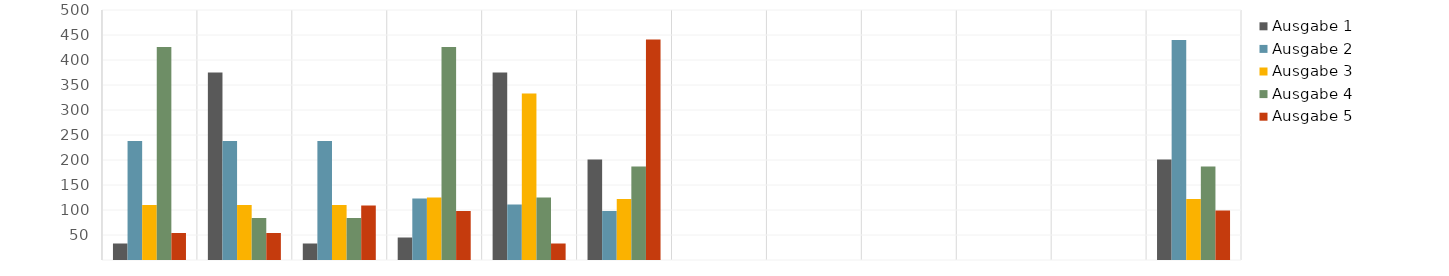
| Category | Ausgabe 1 | Ausgabe 2 | Ausgabe 3 | Ausgabe 4 | Ausgabe 5 |
|---|---|---|---|---|---|
| Jan | 33 | 238 | 110 | 426 | 54 |
| Feb | 375 | 238 | 110 | 84 | 54 |
| Mrz | 33 | 238 | 110 | 84 | 109 |
| Apr | 45 | 123 | 125 | 426 | 98 |
| Mai | 375 | 111 | 333 | 125 | 33 |
| Jun | 201 | 98 | 122 | 187 | 441 |
| Jul | 0 | 0 | 0 | 0 | 0 |
| Aug | 0 | 0 | 0 | 0 | 0 |
| Sep | 0 | 0 | 0 | 0 | 0 |
| Okt | 0 | 0 | 0 | 0 | 0 |
| Nov | 0 | 0 | 0 | 0 | 0 |
| Dez | 201 | 440 | 122 | 187 | 99 |